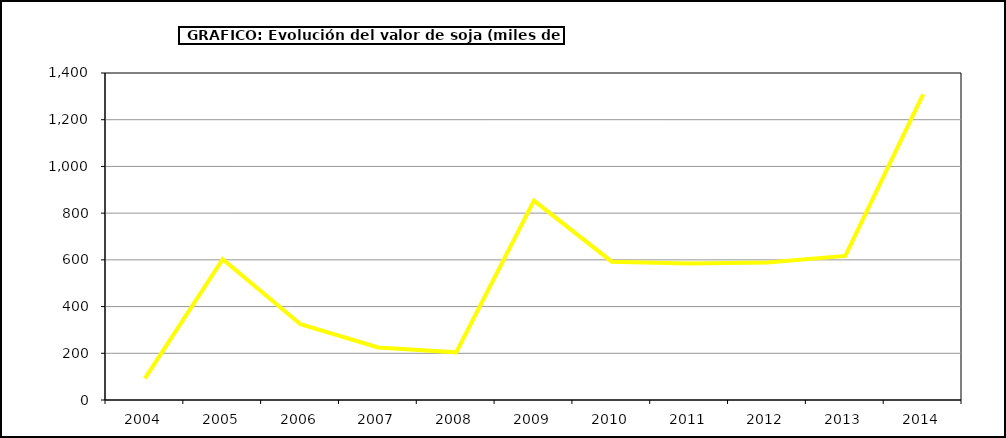
| Category | Valor |
|---|---|
| 2004.0 | 92.984 |
| 2005.0 | 602.754 |
| 2006.0 | 324.61 |
| 2007.0 | 225.216 |
| 2008.0 | 204.204 |
| 2009.0 | 853.62 |
| 2010.0 | 592.162 |
| 2011.0 | 584.814 |
| 2012.0 | 588.253 |
| 2013.0 | 616.743 |
| 2014.0 | 1308.04 |